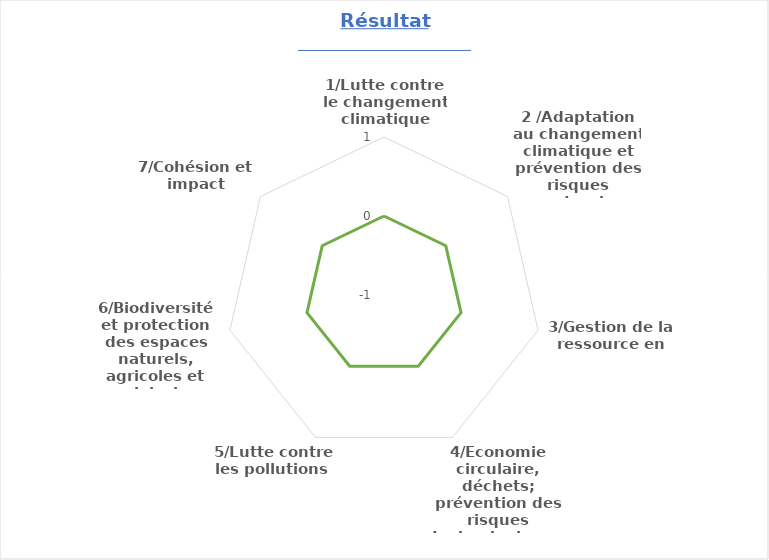
| Category | Résultat auto-évaluation  |
|---|---|
| 1/Lutte contre le changement climatique | 0 |
| 2 /Adaptation au changement climatique et prévention des risques naturels | 0 |
| 3/Gestion de la ressource en eau | 0 |
| 4/Economie circulaire, déchets; prévention des risques technologiques  | 0 |
| 5/Lutte contre les pollutions  | 0 |
| 6/Biodiversité et protection des espaces naturels, agricoles et sylvicoles | 0 |
| 7/Cohésion et impact sociétal | 0 |